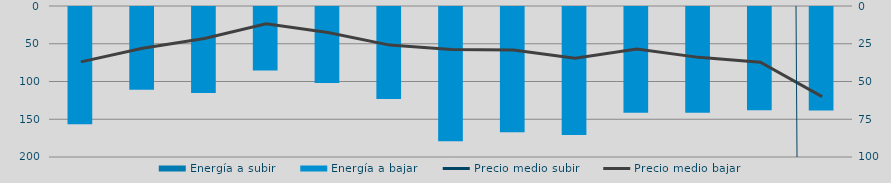
| Category | Energía a subir | Energía a bajar |
|---|---|---|
| D |  | 156.615 |
| E |  | 110.92 |
| F |  | 115.196 |
| M |  | 85.375 |
| A |  | 101.923 |
| M |  | 123.137 |
| J |  | 178.975 |
| J |  | 167.321 |
| A |  | 170.789 |
| S |  | 141.32 |
| O |  | 141.434 |
| N |  | 138.077 |
| D |  | 138.334 |